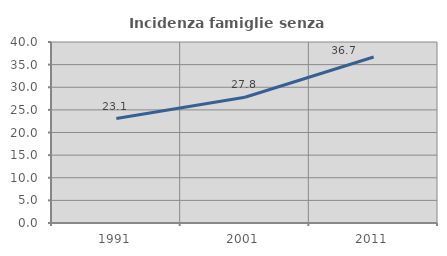
| Category | Incidenza famiglie senza nuclei |
|---|---|
| 1991.0 | 23.086 |
| 2001.0 | 27.793 |
| 2011.0 | 36.677 |